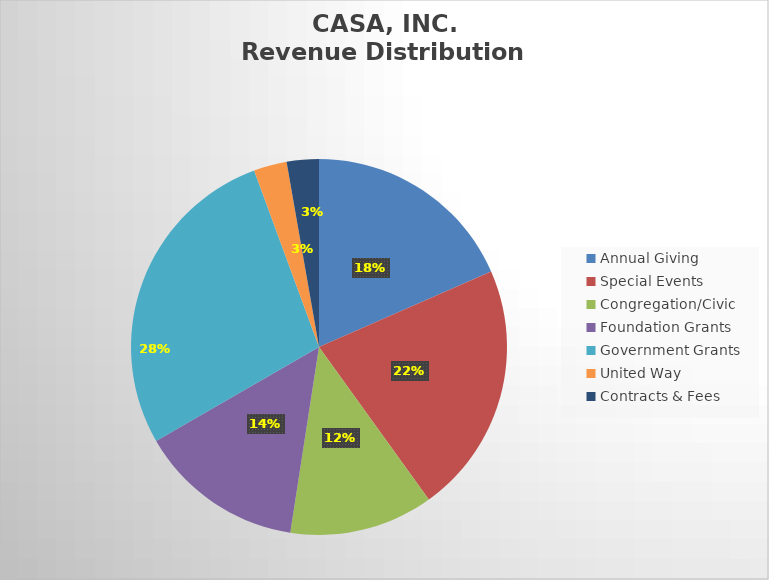
| Category | Series 0 |
|---|---|
| Annual Giving | 148832 |
| Special Events | 175000 |
| Congregation/Civic | 100000 |
| Foundation Grants | 115000 |
| Government Grants | 224000 |
| United Way | 23000 |
| Contracts & Fees | 22320 |